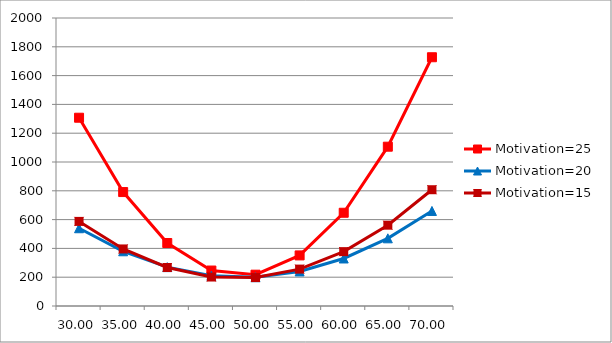
| Category | Motivation=25 | Motivation=20 | Motivation=15 |
|---|---|---|---|
| 30.0 | 1307.5 | 540 | 587.5 |
| 35.0 | 791.25 | 380 | 396.25 |
| 40.0 | 437.5 | 270 | 267.5 |
| 45.0 | 246.25 | 210 | 201.25 |
| 50.0 | 217.5 | 200 | 197.5 |
| 55.0 | 351.25 | 240 | 256.25 |
| 60.0 | 647.5 | 330 | 377.5 |
| 65.0 | 1106.25 | 470 | 561.25 |
| 70.0 | 1727.5 | 660 | 807.5 |